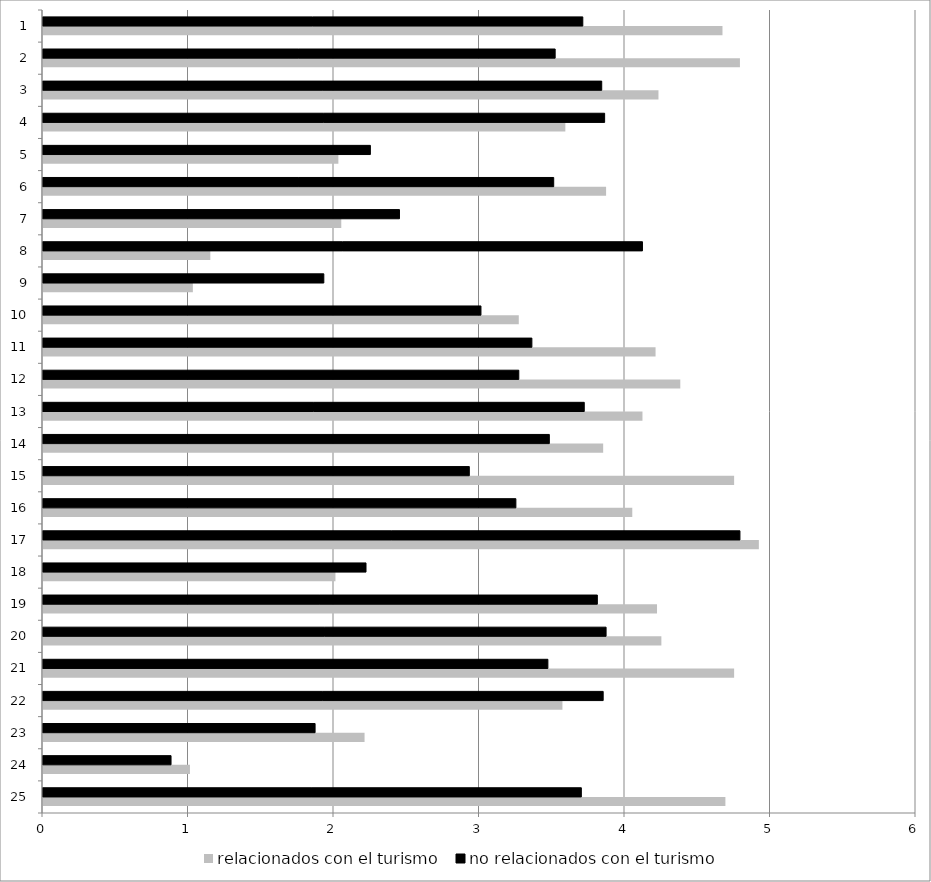
| Category | relacionados con el turismo | no relacionados con el turismo |
|---|---|---|
| 25.0 | 4.69 | 3.7 |
| 24.0 | 1.01 | 0.88 |
| 23.0 | 2.21 | 1.87 |
| 22.0 | 3.57 | 3.85 |
| 21.0 | 4.75 | 3.47 |
| 20.0 | 4.25 | 3.87 |
| 19.0 | 4.22 | 3.81 |
| 18.0 | 2.01 | 2.22 |
| 17.0 | 4.92 | 4.79 |
| 16.0 | 4.05 | 3.25 |
| 15.0 | 4.75 | 2.93 |
| 14.0 | 3.85 | 3.48 |
| 13.0 | 4.12 | 3.72 |
| 12.0 | 4.38 | 3.27 |
| 11.0 | 4.21 | 3.36 |
| 10.0 | 3.27 | 3.01 |
| 9.0 | 1.03 | 1.93 |
| 8.0 | 1.15 | 4.12 |
| 7.0 | 2.05 | 2.45 |
| 6.0 | 3.87 | 3.51 |
| 5.0 | 2.03 | 2.25 |
| 4.0 | 3.59 | 3.86 |
| 3.0 | 4.23 | 3.84 |
| 2.0 | 4.79 | 3.52 |
| 1.0 | 4.67 | 3.71 |